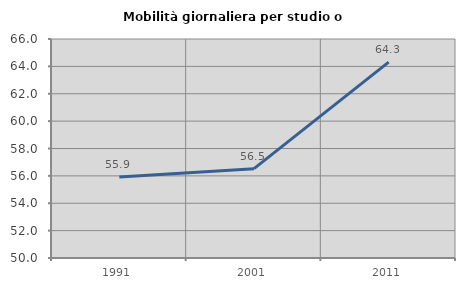
| Category | Mobilità giornaliera per studio o lavoro |
|---|---|
| 1991.0 | 55.918 |
| 2001.0 | 56.526 |
| 2011.0 | 64.31 |